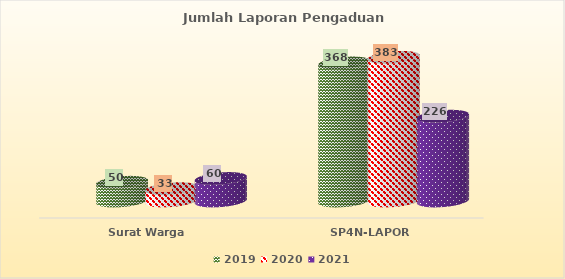
| Category | 2019 | 2020 | 2021 |
|---|---|---|---|
| Surat Warga  | 50 | 33 | 60 |
| SP4N-LAPOR  | 368 | 383 | 226 |